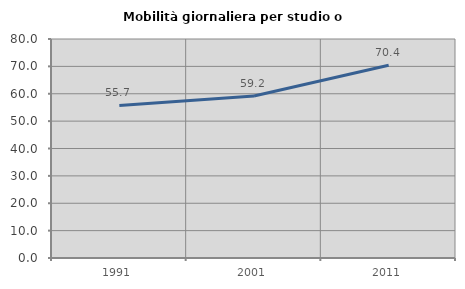
| Category | Mobilità giornaliera per studio o lavoro |
|---|---|
| 1991.0 | 55.738 |
| 2001.0 | 59.164 |
| 2011.0 | 70.4 |